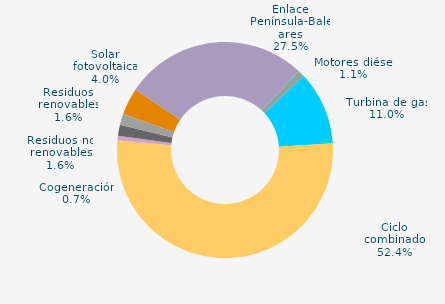
| Category | Series 0 |
|---|---|
| Carbón | 0 |
| Motores diésel | 1.113 |
| Turbina de gas | 10.953 |
| Ciclo combinado | 52.417 |
| Generación auxiliar | 0 |
| Cogeneración | 0.678 |
| Residuos no renovables | 1.633 |
| Residuos renovables | 1.633 |
| Eólica | 0.048 |
| Solar fotovoltaica | 4.015 |
| Otras renovables | 0.021 |
| Enlace Península-Baleares | 27.491 |